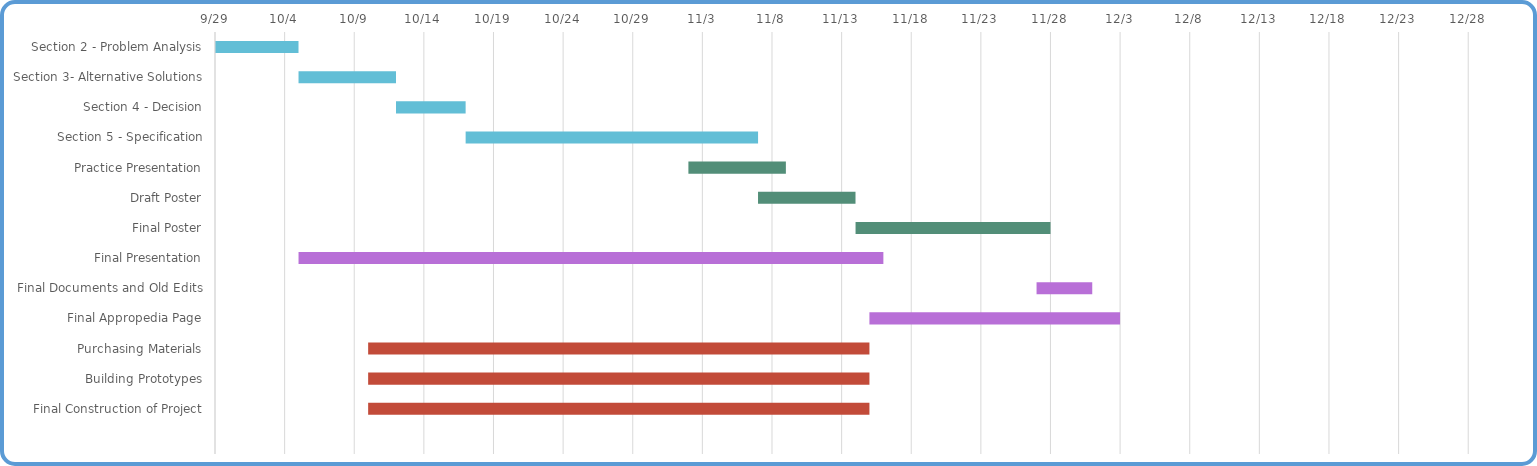
| Category | Start Date | Duration |
|---|---|---|
| Section 2 - Problem Analysis | 9/29/17 | 6 |
| Section 3- Alternative Solutions | 10/5/17 | 7 |
| Section 4 - Decision | 10/12/17 | 5 |
| Section 5 - Specification | 10/17/17 | 21 |
| Practice Presentation | 11/2/17 | 7 |
| Draft Poster | 11/7/17 | 7 |
| Final Poster | 11/14/17 | 14 |
| Final Presentation | 10/5/17 | 42 |
| Final Documents and Old Edits | 11/27/17 | 4 |
| Final Appropedia Page | 11/15/17 | 18 |
| Purchasing Materials | 10/10/17 | 36 |
| Building Prototypes | 10/10/17 | 36 |
| Final Construction of Project | 10/10/17 | 36 |